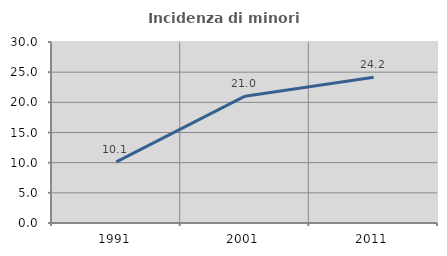
| Category | Incidenza di minori stranieri |
|---|---|
| 1991.0 | 10.145 |
| 2001.0 | 21.019 |
| 2011.0 | 24.161 |